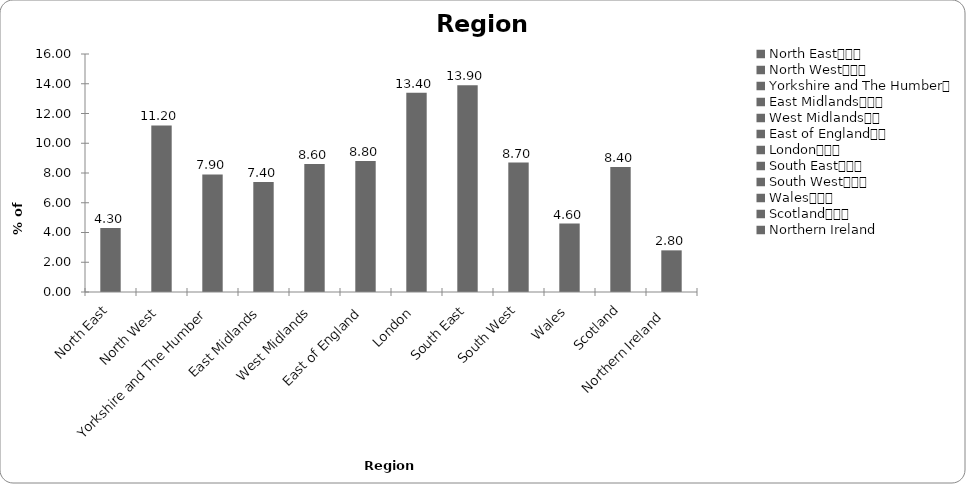
| Category | Region |
|---|---|
| North East			 | 4.3 |
| North West			 | 11.2 |
| Yorkshire and The Humber	 | 7.9 |
| East Midlands			 | 7.4 |
| West Midlands		 | 8.6 |
| East of England		 | 8.8 |
| London			 | 13.4 |
| South East			 | 13.9 |
| South West			 | 8.7 |
| Wales			 | 4.6 |
| Scotland			 | 8.4 |
| Northern Ireland  | 2.8 |